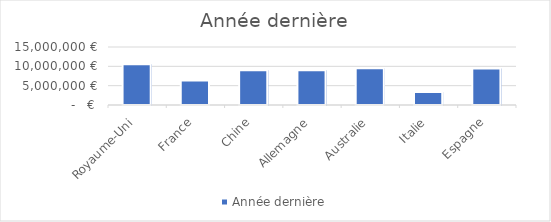
| Category | Année dernière |
|---|---|
| Royaume-Uni | 10562525 |
| France | 6335752 |
| Chine | 8992570 |
| Allemagne | 8987835 |
| Australie | 9520485 |
| Italie | 3348134 |
| Espagne | 9426070 |